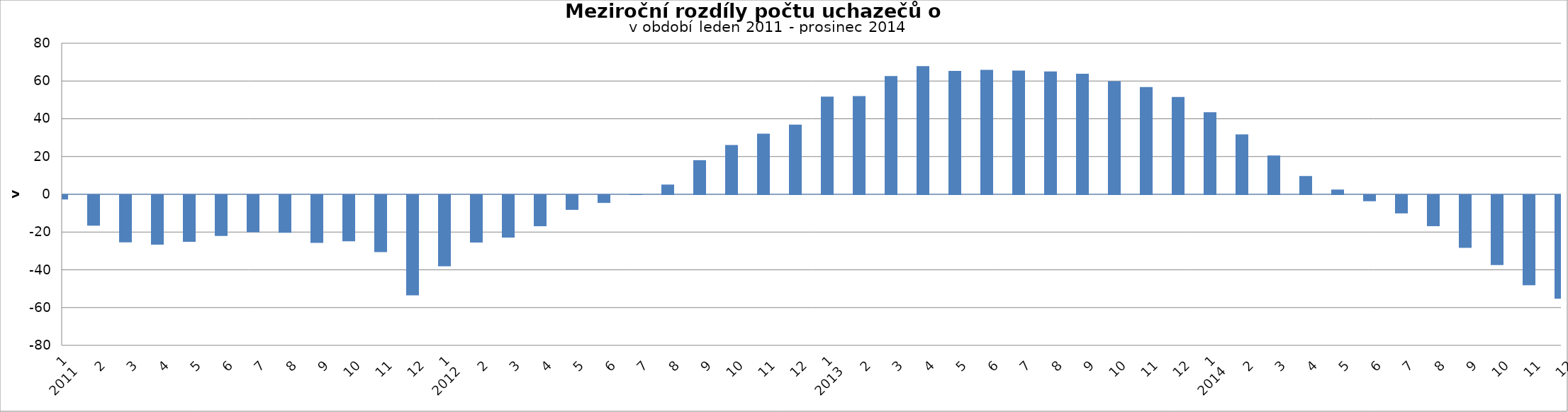
| Category | Series 0 |
|---|---|
| 0 | -2363 |
| 1 | -16239 |
| 2 | -25062 |
| 3 | -26286 |
| 4 | -24823 |
| 5 | -21725 |
| 6 | -19700 |
| 7 | -19959 |
| 8 | -25366 |
| 9 | -24543 |
| 10 | -30236 |
| 11 | -53100 |
| 12 | -37774 |
| 13 | -25211 |
| 14 | -22582 |
| 15 | -16520 |
| 16 | -7857 |
| 17 | -4189 |
| 18 | 13 |
| 19 | 5158 |
| 20 | 18070 |
| 21 | 26144 |
| 22 | 32094 |
| 23 | 36860 |
| 24 | 51720 |
| 25 | 51998 |
| 26 | 62588 |
| 27 | 67906 |
| 28 | 65364 |
| 29 | 65887 |
| 30 | 65499 |
| 31 | 65038 |
| 32 | 63873 |
| 33 | 59919 |
| 34 | 56815 |
| 35 | 51522 |
| 36 | 43465 |
| 37 | 31707 |
| 38 | 20547 |
| 39 | 9680 |
| 40 | 2510 |
| 41 | -3294 |
| 42 | -9732 |
| 43 | -16506 |
| 44 | -27960 |
| 45 | -37043 |
| 46 | -47805 |
| 47 | -54919 |